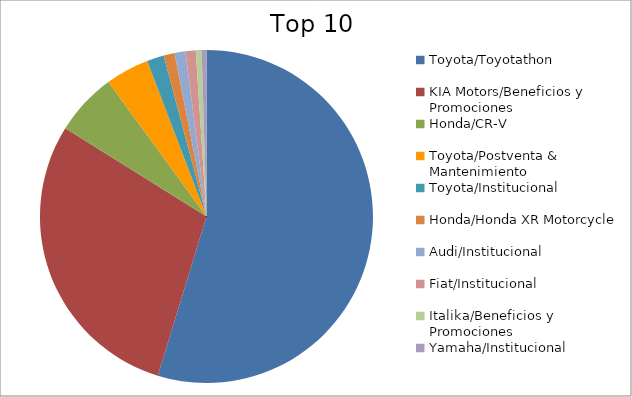
| Category | Series 0 |
|---|---|
| Toyota/Toyotathon | 53.81 |
| KIA Motors/Beneficios y Promociones | 28.66 |
| Honda/CR-V | 5.99 |
| Toyota/Postventa & Mantenimiento | 4.16 |
| Toyota/Institucional | 1.63 |
| Honda/Honda XR Motorcycle | 1.04 |
| Audi/Institucional | 1.04 |
| Fiat/Institucional | 0.98 |
| Italika/Beneficios y Promociones | 0.55 |
| Yamaha/Institucional | 0.46 |